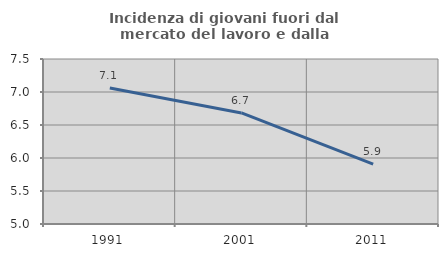
| Category | Incidenza di giovani fuori dal mercato del lavoro e dalla formazione  |
|---|---|
| 1991.0 | 7.06 |
| 2001.0 | 6.683 |
| 2011.0 | 5.908 |